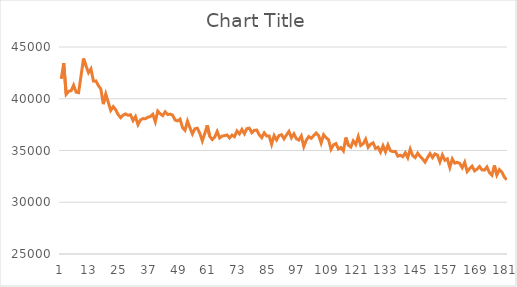
| Category | Series 0 |
|---|---|
| 0 | 41916.3 |
| 1 | 43441.6 |
| 2 | 40428.8 |
| 3 | 40723.2 |
| 4 | 40773 |
| 5 | 41309.2 |
| 6 | 40637.7 |
| 7 | 40585.6 |
| 8 | 42214.1 |
| 9 | 43887 |
| 10 | 43180.4 |
| 11 | 42522 |
| 12 | 42886.8 |
| 13 | 41708.6 |
| 14 | 41725.6 |
| 15 | 41274.5 |
| 16 | 40948.2 |
| 17 | 39478.6 |
| 18 | 40453.6 |
| 19 | 39660.6 |
| 20 | 38870.8 |
| 21 | 39237.1 |
| 22 | 38930.3 |
| 23 | 38469.9 |
| 24 | 38176.1 |
| 25 | 38413.3 |
| 26 | 38533.4 |
| 27 | 38401.5 |
| 28 | 38455.3 |
| 29 | 37894.4 |
| 30 | 38276.2 |
| 31 | 37498.1 |
| 32 | 37951.4 |
| 33 | 38083.7 |
| 34 | 38069.6 |
| 35 | 38214 |
| 36 | 38282.9 |
| 37 | 38498.9 |
| 38 | 37776.8 |
| 39 | 38807.7 |
| 40 | 38543.5 |
| 41 | 38368.4 |
| 42 | 38734.5 |
| 43 | 38472.4 |
| 44 | 38512.8 |
| 45 | 38420.5 |
| 46 | 37944.6 |
| 47 | 37859.4 |
| 48 | 38028.3 |
| 49 | 37214.1 |
| 50 | 36950.5 |
| 51 | 37839.2 |
| 52 | 37190.2 |
| 53 | 36600.4 |
| 54 | 37099.8 |
| 55 | 37154.8 |
| 56 | 36657.7 |
| 57 | 35925.8 |
| 58 | 36633.1 |
| 59 | 37436.9 |
| 60 | 36366.1 |
| 61 | 36056.1 |
| 62 | 36285.4 |
| 63 | 36839.9 |
| 64 | 36214.1 |
| 65 | 36387.9 |
| 66 | 36440.5 |
| 67 | 36498.9 |
| 68 | 36210.3 |
| 69 | 36493.7 |
| 70 | 36335.9 |
| 71 | 36885 |
| 72 | 36606 |
| 73 | 37036.5 |
| 74 | 36618.5 |
| 75 | 37107.4 |
| 76 | 37154.5 |
| 77 | 36714.1 |
| 78 | 36951.4 |
| 79 | 36976.4 |
| 80 | 36520.7 |
| 81 | 36241.6 |
| 82 | 36707 |
| 83 | 36398.4 |
| 84 | 36409.3 |
| 85 | 35598.6 |
| 86 | 36445.5 |
| 87 | 36025.2 |
| 88 | 36448.1 |
| 89 | 36529.3 |
| 90 | 36130 |
| 91 | 36504.4 |
| 92 | 36844.8 |
| 93 | 36230.6 |
| 94 | 36610.8 |
| 95 | 36136.1 |
| 96 | 36006.5 |
| 97 | 36410.4 |
| 98 | 35381.9 |
| 99 | 35995.1 |
| 100 | 36349 |
| 101 | 36175.9 |
| 102 | 36441.2 |
| 103 | 36686.8 |
| 104 | 36435.4 |
| 105 | 35719.3 |
| 106 | 36523.9 |
| 107 | 36240.1 |
| 108 | 36040 |
| 109 | 35111.7 |
| 110 | 35550.2 |
| 111 | 35671.1 |
| 112 | 35137.5 |
| 113 | 35286 |
| 114 | 34965.1 |
| 115 | 36248.7 |
| 116 | 35508.3 |
| 117 | 35332.8 |
| 118 | 35932.3 |
| 119 | 35579.1 |
| 120 | 36346.7 |
| 121 | 35485.6 |
| 122 | 35651.1 |
| 123 | 36096.9 |
| 124 | 35309.6 |
| 125 | 35603.9 |
| 126 | 35740.1 |
| 127 | 35196.1 |
| 128 | 35323 |
| 129 | 34846.3 |
| 130 | 35461.3 |
| 131 | 34869.9 |
| 132 | 35537.5 |
| 133 | 34971 |
| 134 | 34894.8 |
| 135 | 34917.1 |
| 136 | 34451.7 |
| 137 | 34543.5 |
| 138 | 34404 |
| 139 | 34778.9 |
| 140 | 34300.2 |
| 141 | 35133.2 |
| 142 | 34507.3 |
| 143 | 34317.9 |
| 144 | 34737 |
| 145 | 34422.4 |
| 146 | 34180.8 |
| 147 | 33877.5 |
| 148 | 34323.3 |
| 149 | 34700.7 |
| 150 | 34317.3 |
| 151 | 34673.3 |
| 152 | 34556.4 |
| 153 | 33894 |
| 154 | 34572.1 |
| 155 | 34052.3 |
| 156 | 34193.4 |
| 157 | 33352.8 |
| 158 | 34185.5 |
| 159 | 33784 |
| 160 | 33863.1 |
| 161 | 33754.3 |
| 162 | 33337.8 |
| 163 | 33865.9 |
| 164 | 32969.1 |
| 165 | 33259.7 |
| 166 | 33486.8 |
| 167 | 33031.1 |
| 168 | 33200.5 |
| 169 | 33451.8 |
| 170 | 33132 |
| 171 | 33107.4 |
| 172 | 33410.9 |
| 173 | 32864.7 |
| 174 | 32616.3 |
| 175 | 33553.1 |
| 176 | 32638.2 |
| 177 | 33155.1 |
| 178 | 32921 |
| 179 | 32450.6 |
| 180 | 32166.4 |